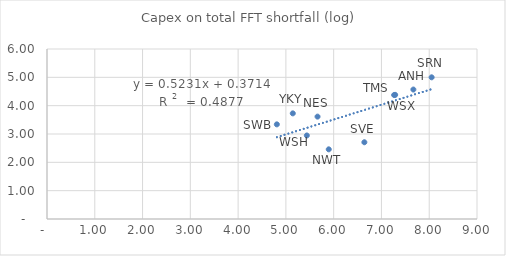
| Category | Series 0 |
|---|---|
| 7.668257323560314 | 4.569 |
| 5.662404770202223 | 3.613 |
| 5.8971538676367405 | 2.459 |
| 8.050547119261996 | 5 |
| 6.64253895124602 | 2.709 |
| 4.810557015713042 | 3.34 |
| 7.266142755699176 | 4.376 |
| 5.438079308923196 | 2.948 |
| 7.287081729480606 | 4.381 |
| 5.14436166771075 | 3.728 |